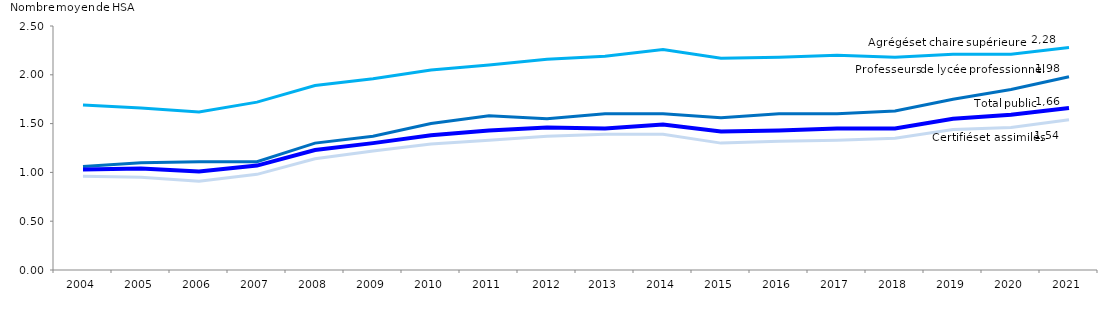
| Category | Agrégés et chaire supérieure | Certifiés et assimilés | Professeurs de lycée professionnel | Total secteur public |
|---|---|---|---|---|
| 2004 | 1.69 | 0.96 | 1.06 | 1.03 |
| 2005 | 1.66 | 0.95 | 1.1 | 1.04 |
| 2006 | 1.62 | 0.91 | 1.11 | 1.01 |
| 2007 | 1.72 | 0.98 | 1.11 | 1.07 |
| 2008 | 1.89 | 1.14 | 1.3 | 1.23 |
| 2009 | 1.96 | 1.22 | 1.37 | 1.3 |
| 2010 | 2.05 | 1.29 | 1.5 | 1.38 |
| 2011 | 2.1 | 1.33 | 1.58 | 1.43 |
| 2012
 | 2.16 | 1.37 | 1.55 | 1.46 |
| 2013 | 2.19 | 1.39 | 1.6 | 1.45 |
| 2014 | 2.26 | 1.39 | 1.6 | 1.49 |
| 2015 | 2.17 | 1.3 | 1.56 | 1.42 |
| 2016 | 2.18 | 1.32 | 1.6 | 1.43 |
| 2017 | 2.2 | 1.33 | 1.6 | 1.45 |
| 2018 | 2.18 | 1.35 | 1.63 | 1.45 |
| 2019 | 2.21 | 1.44 | 1.75 | 1.55 |
| 2020 | 2.21 | 1.46 | 1.85 | 1.59 |
| 2021 | 2.28 | 1.54 | 1.98 | 1.66 |